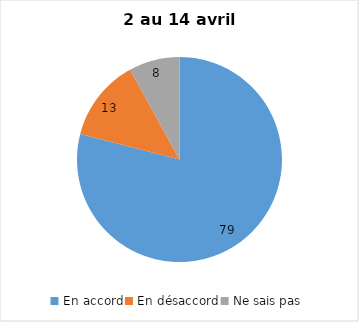
| Category | Series 0 |
|---|---|
| En accord | 79 |
| En désaccord | 13 |
| Ne sais pas | 8 |